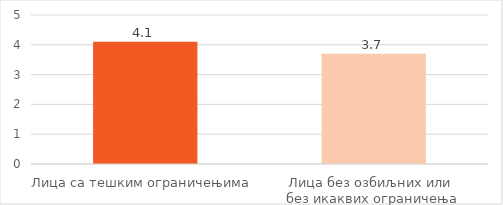
| Category | % |
|---|---|
| Лица са тешким ограничењима | 4.1 |
| Лица без озбиљних или 
 без икаквих ограничења  | 3.7 |